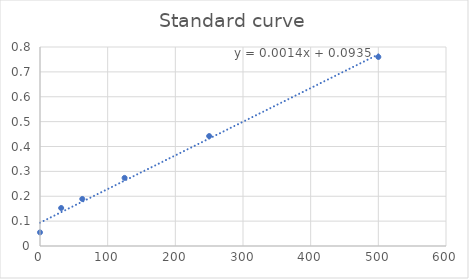
| Category | Series 0 |
|---|---|
| 0.0 | 0.055 |
| 31.3 | 0.153 |
| 62.5 | 0.189 |
| 125.0 | 0.274 |
| 250.0 | 0.442 |
| 500.0 | 0.76 |